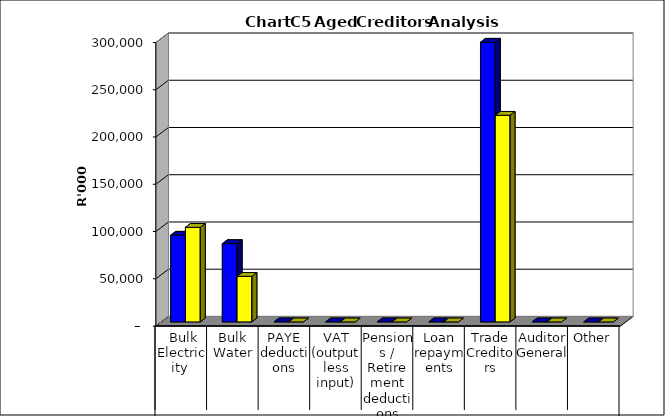
| Category | 2019/20 | Budget Year 2020/21 |
|---|---|---|
|  Bulk Electricity  | 91751594.33 | 100085003.83 |
| Bulk Water | 82841890.27 | 48206104.93 |
| PAYE deductions | 0 | 0 |
| VAT (output less input) | 0 | 0 |
| Pensions / Retirement deductions | 0 | 0 |
| Loan repayments | 0 | 0 |
| Trade Creditors | 295980095.86 | 218673791.63 |
| Auditor General | 0 | 0 |
| Other | 0 | 0 |